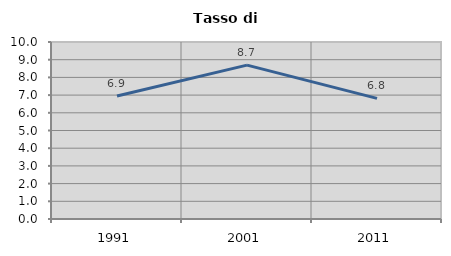
| Category | Tasso di disoccupazione   |
|---|---|
| 1991.0 | 6.947 |
| 2001.0 | 8.696 |
| 2011.0 | 6.813 |